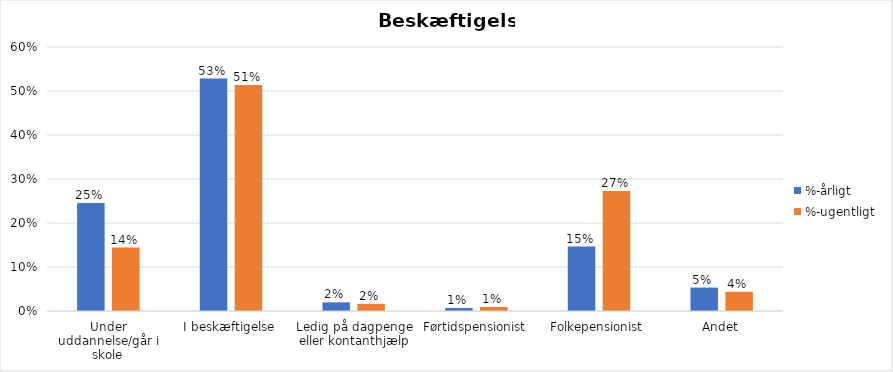
| Category | %-årligt | %-ugentligt |
|---|---|---|
| Under uddannelse/går i skole | 0.246 | 0.144 |
| I beskæftigelse | 0.528 | 0.514 |
| Ledig på dagpenge eller kontanthjælp | 0.02 | 0.016 |
| Førtidspensionist | 0.007 | 0.009 |
| Folkepensionist | 0.146 | 0.273 |
| Andet | 0.053 | 0.044 |